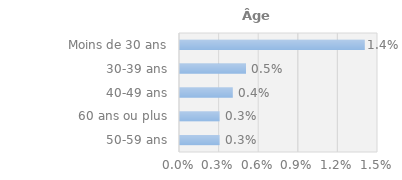
| Category | Series 0 |
|---|---|
| 50-59 ans | 0.003 |
| 60 ans ou plus | 0.003 |
| 40-49 ans | 0.004 |
| 30-39 ans | 0.005 |
| Moins de 30 ans | 0.014 |